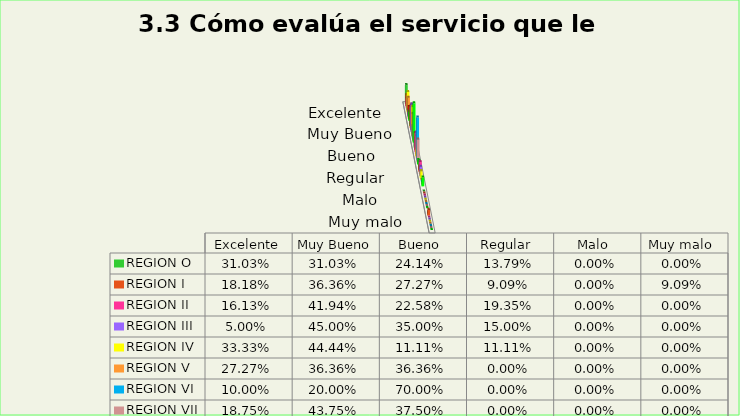
| Category | REGION O | REGION I  | REGION II | REGION III | REGION IV | REGION V  | REGION VI  | REGION VII  | REGION VIII |
|---|---|---|---|---|---|---|---|---|---|
| Excelente | 0.31 | 0.182 | 0.161 | 0.05 | 0.333 | 0.273 | 0.1 | 0.188 | 0.143 |
| Muy Bueno | 0.31 | 0.364 | 0.419 | 0.45 | 0.444 | 0.364 | 0.2 | 0.438 | 0.643 |
| Bueno  | 0.241 | 0.273 | 0.226 | 0.35 | 0.111 | 0.364 | 0.7 | 0.375 | 0.071 |
| Regular  | 0.138 | 0.091 | 0.194 | 0.15 | 0.111 | 0 | 0 | 0 | 0.143 |
| Malo  | 0 | 0 | 0 | 0 | 0 | 0 | 0 | 0 | 0 |
| Muy malo  | 0 | 0.091 | 0 | 0 | 0 | 0 | 0 | 0 | 0 |